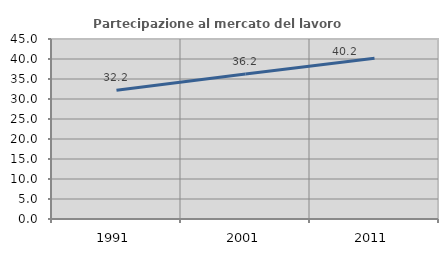
| Category | Partecipazione al mercato del lavoro  femminile |
|---|---|
| 1991.0 | 32.163 |
| 2001.0 | 36.228 |
| 2011.0 | 40.182 |